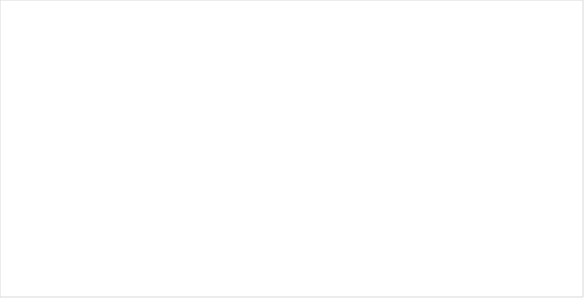
| Category | Summa |
|---|---|
| 0 | 0.308 |
| 1 | 0.231 |
| 2 | 0.462 |
| 3 | 0.392 |
| 4 | 0.297 |
| 5 | 0.311 |
| 6 | 0.346 |
| 7 | 0.254 |
| 8 | 0.4 |